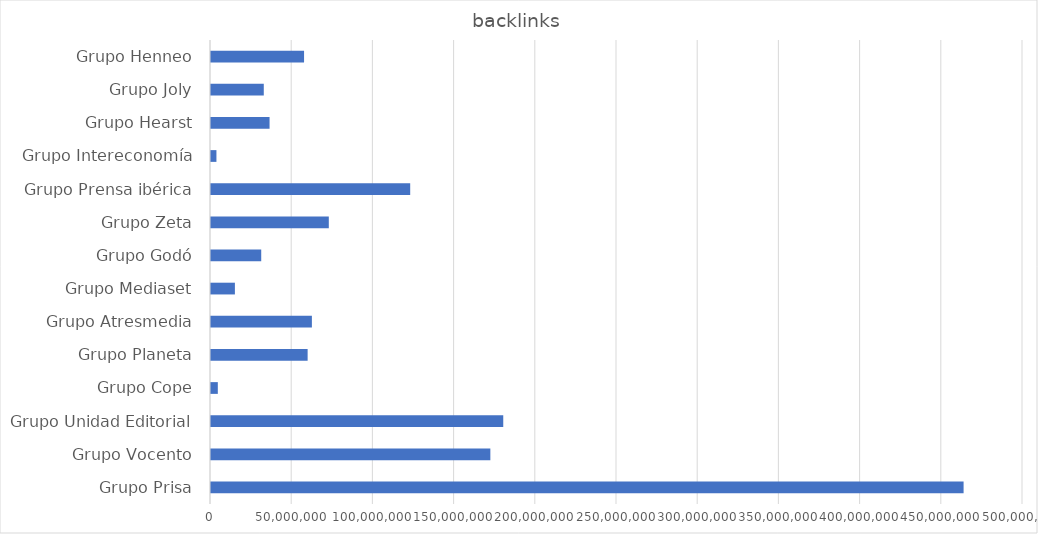
| Category | backlinks |
|---|---|
| Grupo Prisa | 463419000 |
| Grupo Vocento | 172014609 |
| Grupo Unidad Editorial | 179958700 |
| Grupo Cope | 4197000 |
| Grupo Planeta | 59501400 |
| Grupo Atresmedia | 62123000 |
| Grupo Mediaset | 14717200 |
| Grupo Godó | 30925402 |
| Grupo Zeta | 72539522 |
| Grupo Prensa ibérica | 122658100 |
| Grupo Intereconomía | 3345337 |
| Grupo Hearst | 36062000 |
| Grupo Joly | 32503000 |
| Grupo Henneo | 57303000 |